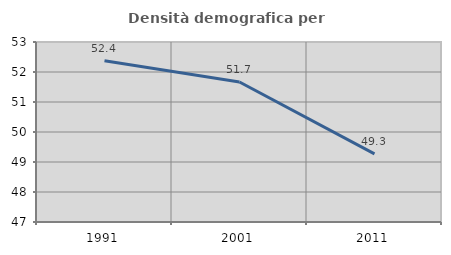
| Category | Densità demografica |
|---|---|
| 1991.0 | 52.373 |
| 2001.0 | 51.667 |
| 2011.0 | 49.27 |